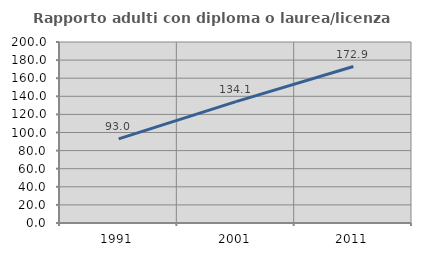
| Category | Rapporto adulti con diploma o laurea/licenza media  |
|---|---|
| 1991.0 | 92.99 |
| 2001.0 | 134.091 |
| 2011.0 | 172.906 |